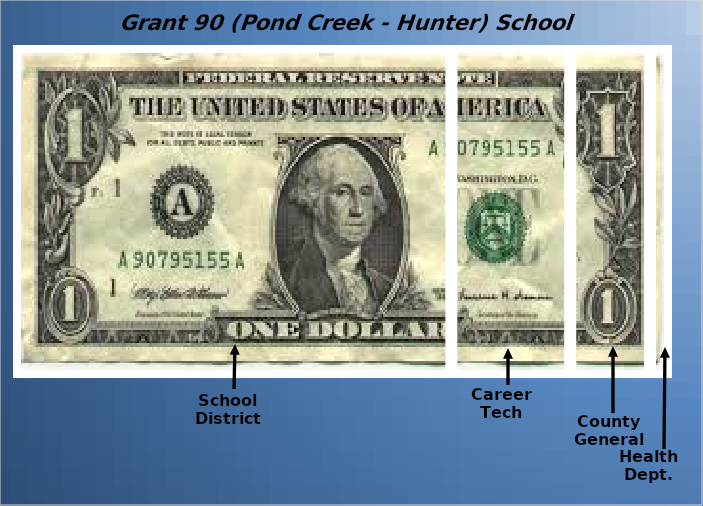
| Category | School District | Career Tech | County General | Health Dept. |
|---|---|---|---|---|
| 0 | 0.666 | 0.181 | 0.122 | 0.031 |